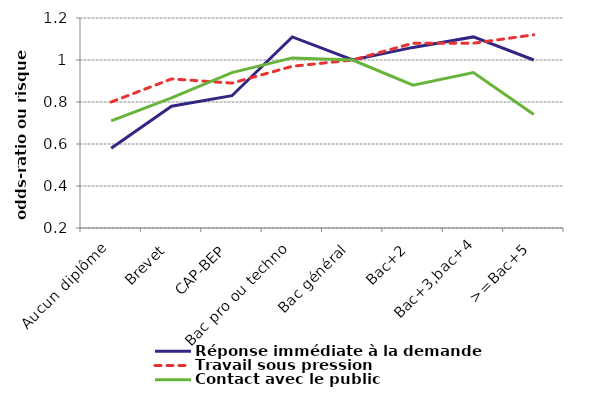
| Category | Réponse immédiate à la demande | Travail sous pression | Contact avec le public |
|---|---|---|---|
| Aucun diplôme | 0.58 | 0.8 | 0.71 |
| Brevet | 0.78 | 0.91 | 0.82 |
| CAP-BEP | 0.83 | 0.89 | 0.94 |
| Bac pro ou techno | 1.11 | 0.97 | 1.01 |
| Bac général | 1 | 1 | 1 |
| Bac+2 | 1.06 | 1.08 | 0.88 |
| Bac+3,bac+4 | 1.11 | 1.08 | 0.94 |
| >=Bac+5 | 1 | 1.12 | 0.74 |